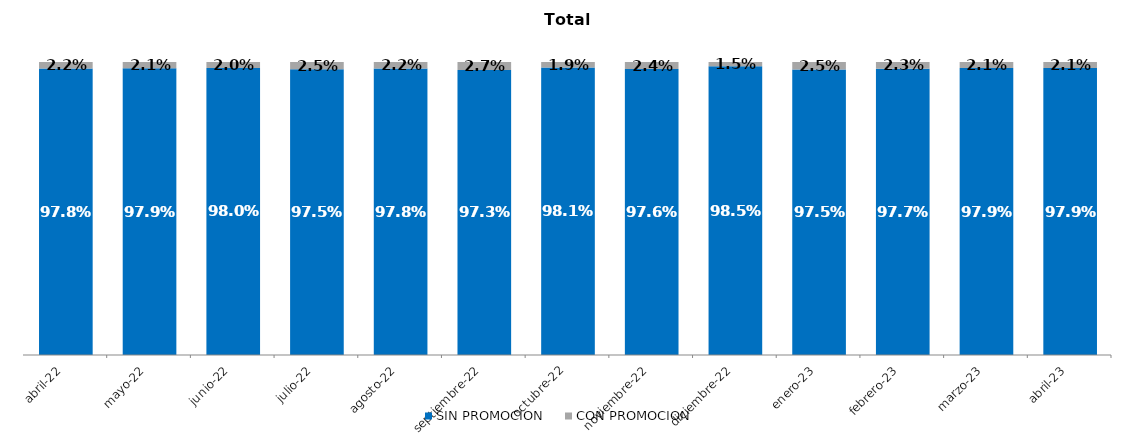
| Category | SIN PROMOCION   | CON PROMOCION   |
|---|---|---|
| 2022-04-01 | 0.978 | 0.022 |
| 2022-05-01 | 0.979 | 0.021 |
| 2022-06-01 | 0.98 | 0.02 |
| 2022-07-01 | 0.975 | 0.025 |
| 2022-08-01 | 0.978 | 0.022 |
| 2022-09-01 | 0.973 | 0.027 |
| 2022-10-01 | 0.981 | 0.019 |
| 2022-11-01 | 0.976 | 0.024 |
| 2022-12-01 | 0.985 | 0.015 |
| 2023-01-01 | 0.975 | 0.025 |
| 2023-02-01 | 0.977 | 0.023 |
| 2023-03-01 | 0.979 | 0.021 |
| 2023-04-01 | 0.979 | 0.021 |